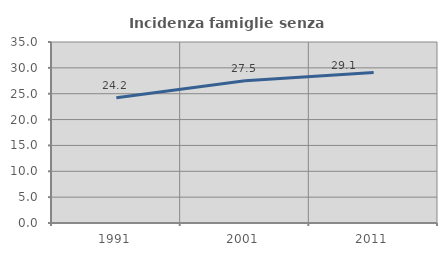
| Category | Incidenza famiglie senza nuclei |
|---|---|
| 1991.0 | 24.231 |
| 2001.0 | 27.515 |
| 2011.0 | 29.1 |